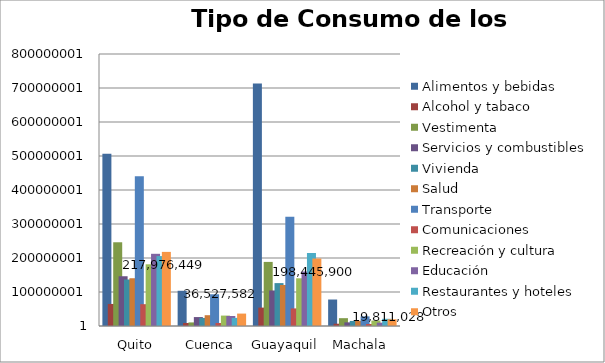
| Category | Alimentos y bebidas | Alcohol y tabaco | Vestimenta | Servicios y combustibles | Vivienda  | Salud | Transporte | Comunicaciones | Recreación y cultura | Educación | Restaurantes y hoteles | Otros |
|---|---|---|---|---|---|---|---|---|---|---|---|---|
| Quito | 506324222 | 64830453 | 246283689 | 146357570 | 136740771 | 140482489 | 440671927 | 64193310 | 181508305 | 212344759 | 205633976 | 217976449 |
| Cuenca | 103605148 | 8846470 | 10548014 | 26269881 | 23724811 | 31744059 | 93306799 | 8821805 | 30647452 | 29438726 | 23905957 | 36527582 |
| Guayaquil | 712889348 | 54105472 | 188505956 | 104504222 | 126160309 | 120699008 | 321669704 | 51757983 | 140368459 | 160163157 | 214762599 | 198445900 |
| Machala | 77899715 | 6739882 | 23044098 | 10759778 | 14860622 | 15371605 | 28300485 | 5869072 | 15890931 | 9818561 | 21204648 | 19811028 |